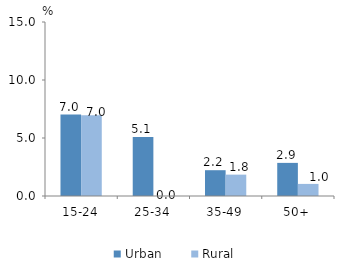
| Category | Urban | Rural |
|---|---|---|
| 15-24 | 7.023 | 6.968 |
| 25-34 | 5.084 | 0 |
| 35-49 | 2.224 | 1.842 |
| 50+ | 2.855 | 1.042 |